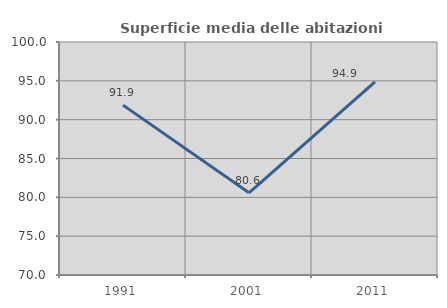
| Category | Superficie media delle abitazioni occupate |
|---|---|
| 1991.0 | 91.871 |
| 2001.0 | 80.589 |
| 2011.0 | 94.876 |